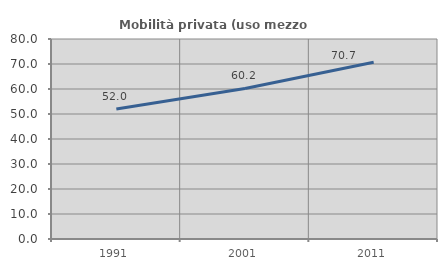
| Category | Mobilità privata (uso mezzo privato) |
|---|---|
| 1991.0 | 52.015 |
| 2001.0 | 60.231 |
| 2011.0 | 70.679 |